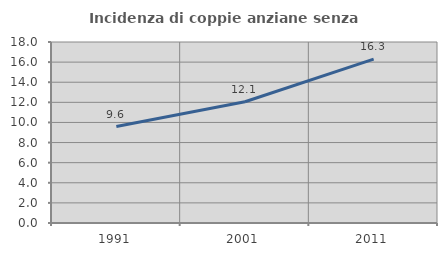
| Category | Incidenza di coppie anziane senza figli  |
|---|---|
| 1991.0 | 9.588 |
| 2001.0 | 12.057 |
| 2011.0 | 16.294 |